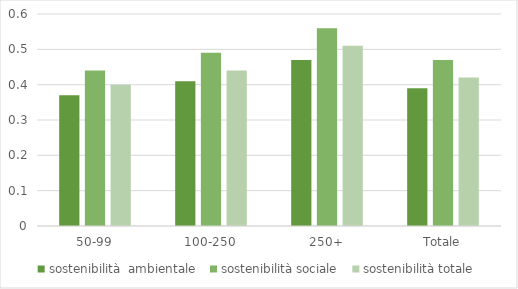
| Category | sostenibilità  ambientale  | sostenibilità sociale  | sostenibilità totale |
|---|---|---|---|
| 50-99 | 0.37 | 0.44 | 0.4 |
| 100-250 | 0.41 | 0.49 | 0.44 |
| 250+ | 0.47 | 0.56 | 0.51 |
| Totale | 0.39 | 0.47 | 0.42 |